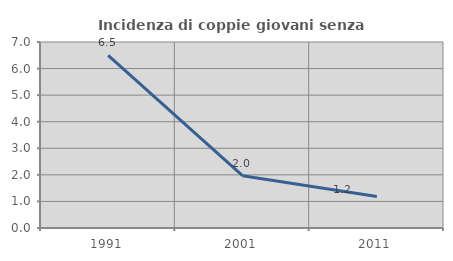
| Category | Incidenza di coppie giovani senza figli |
|---|---|
| 1991.0 | 6.494 |
| 2001.0 | 1.969 |
| 2011.0 | 1.186 |